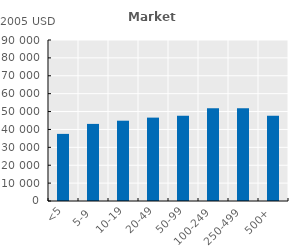
| Category | Series 0 |
|---|---|
| <5 | 37515.012 |
| 5-9 | 43099.332 |
| 10-19 | 44889.031 |
| 20-49 | 46614.168 |
| 50-99 | 47613.43 |
| 100-249 | 51896.605 |
| 250-499 | 51824.625 |
| 500+ | 47644.793 |